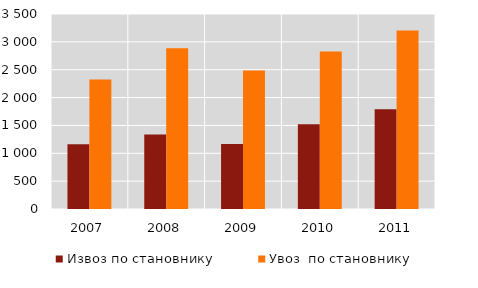
| Category | Извоз по становнику  | Увоз  по становнику  |
|---|---|---|
| 2007.0 | 1161 | 2325 |
| 2008.0 | 1337 | 2885 |
| 2009.0 | 1166 | 2486 |
| 2010.0 | 1520 | 2828 |
| 2011.0 | 1791 | 3202 |